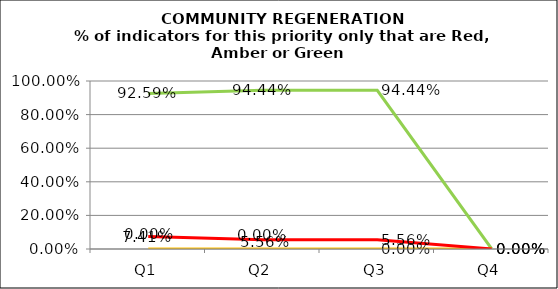
| Category | Green | Amber | Red |
|---|---|---|---|
| Q1 | 0.926 | 0 | 0.074 |
| Q2 | 0.944 | 0 | 0.056 |
| Q3 | 0.944 | 0 | 0.056 |
| Q4 | 0 | 0 | 0 |